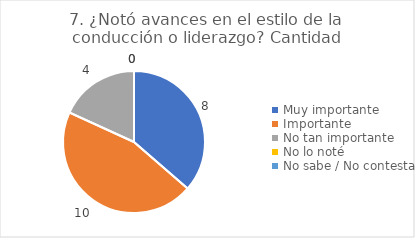
| Category | 7. ¿Notó avances en el estilo de la conducción o liderazgo? |
|---|---|
| Muy importante  | 0.364 |
| Importante  | 0.455 |
| No tan importante  | 0.182 |
| No lo noté  | 0 |
| No sabe / No contesta | 0 |